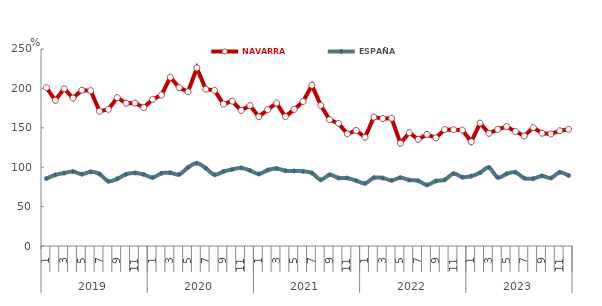
| Category | NAVARRA | ESPAÑA |
|---|---|---|
| 0 | 200.978 | 85.576 |
| 1 | 184.888 | 90.261 |
| 2 | 199.668 | 92.528 |
| 3 | 187.748 | 94.485 |
| 4 | 197.702 | 91.149 |
| 5 | 197.205 | 94.18 |
| 6 | 170.95 | 91.463 |
| 7 | 173.4 | 82.194 |
| 8 | 188.335 | 85.226 |
| 9 | 181.2 | 91.028 |
| 10 | 181.433 | 92.704 |
| 11 | 175.709 | 90.748 |
| 12 | 186.094 | 86.882 |
| 13 | 191.679 | 92.288 |
| 14 | 214.12 | 92.916 |
| 15 | 201.109 | 90.803 |
| 16 | 195.782 | 99.657 |
| 17 | 225.937 | 105.049 |
| 18 | 198.98 | 98.772 |
| 19 | 197.556 | 90.444 |
| 20 | 180.186 | 94.504 |
| 21 | 183.821 | 97.218 |
| 22 | 172.024 | 99.109 |
| 23 | 178.22 | 95.825 |
| 24 | 164.052 | 91.381 |
| 25 | 173.038 | 96.313 |
| 26 | 181.417 | 98.391 |
| 27 | 164.128 | 95.464 |
| 28 | 173.359 | 95.257 |
| 29 | 183.411 | 94.813 |
| 30 | 204.012 | 92.638 |
| 31 | 178.424 | 84.041 |
| 32 | 160.242 | 90.423 |
| 33 | 155.643 | 86.306 |
| 34 | 142.302 | 86.24 |
| 35 | 146.638 | 82.924 |
| 36 | 137.955 | 79.473 |
| 37 | 163.543 | 86.62 |
| 38 | 161.66 | 86.292 |
| 39 | 162.167 | 83.257 |
| 40 | 130.372 | 86.707 |
| 41 | 143.771 | 83.761 |
| 42 | 135.207 | 82.784 |
| 43 | 141.612 | 77.55 |
| 44 | 137.238 | 82.509 |
| 45 | 147.742 | 83.939 |
| 46 | 147.595 | 91.849 |
| 47 | 147.192 | 87.327 |
| 48 | 132.204 | 88.658 |
| 49 | 156.007 | 93.017 |
| 50 | 142.945 | 99.597 |
| 51 | 147.934 | 86.97 |
| 52 | 151.519 | 91.603 |
| 53 | 145.25 | 93.519 |
| 54 | 139.66 | 86.131 |
| 55 | 150.241 | 85.51 |
| 56 | 143.138 | 88.987 |
| 57 | 142.177 | 86.272 |
| 58 | 146.163 | 93.497 |
| 59 | 148.091 | 89.484 |